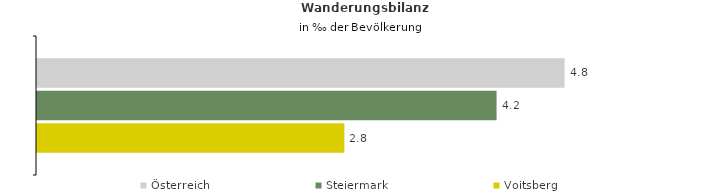
| Category | Österreich | Steiermark | Voitsberg |
|---|---|---|---|
| Wanderungsrate in ‰ der Bevölkerung, Periode 2017-2021 | 4.789 | 4.172 | 2.79 |